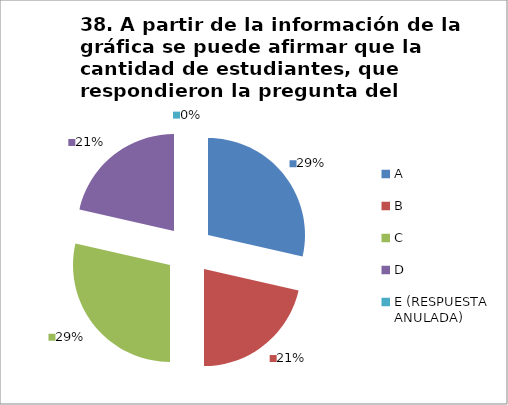
| Category | CANTIDAD DE RESPUESTAS PREGUNTA (38) | PORCENTAJE |
|---|---|---|
| A | 8 | 0.286 |
| B | 6 | 0.214 |
| C | 8 | 0.286 |
| D | 6 | 0.214 |
| E (RESPUESTA ANULADA) | 0 | 0 |